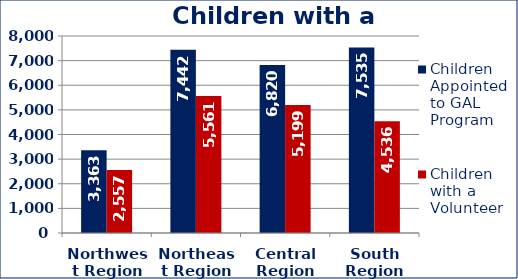
| Category | Children Appointed to GAL Program  | Children with a Volunteer  |
|---|---|---|
| Northwest Region | 3363 | 2557 |
| Northeast Region | 7442 | 5561 |
| Central Region | 6820 | 5199 |
| South Region | 7535 | 4536 |